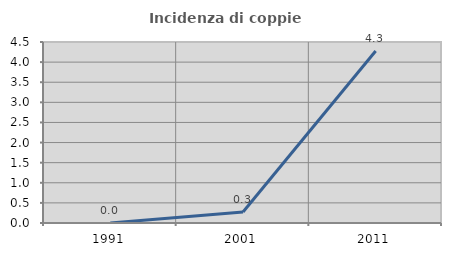
| Category | Incidenza di coppie miste |
|---|---|
| 1991.0 | 0 |
| 2001.0 | 0.272 |
| 2011.0 | 4.276 |